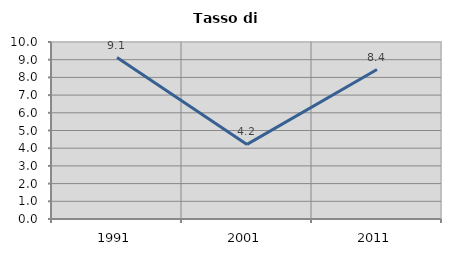
| Category | Tasso di disoccupazione   |
|---|---|
| 1991.0 | 9.118 |
| 2001.0 | 4.214 |
| 2011.0 | 8.446 |